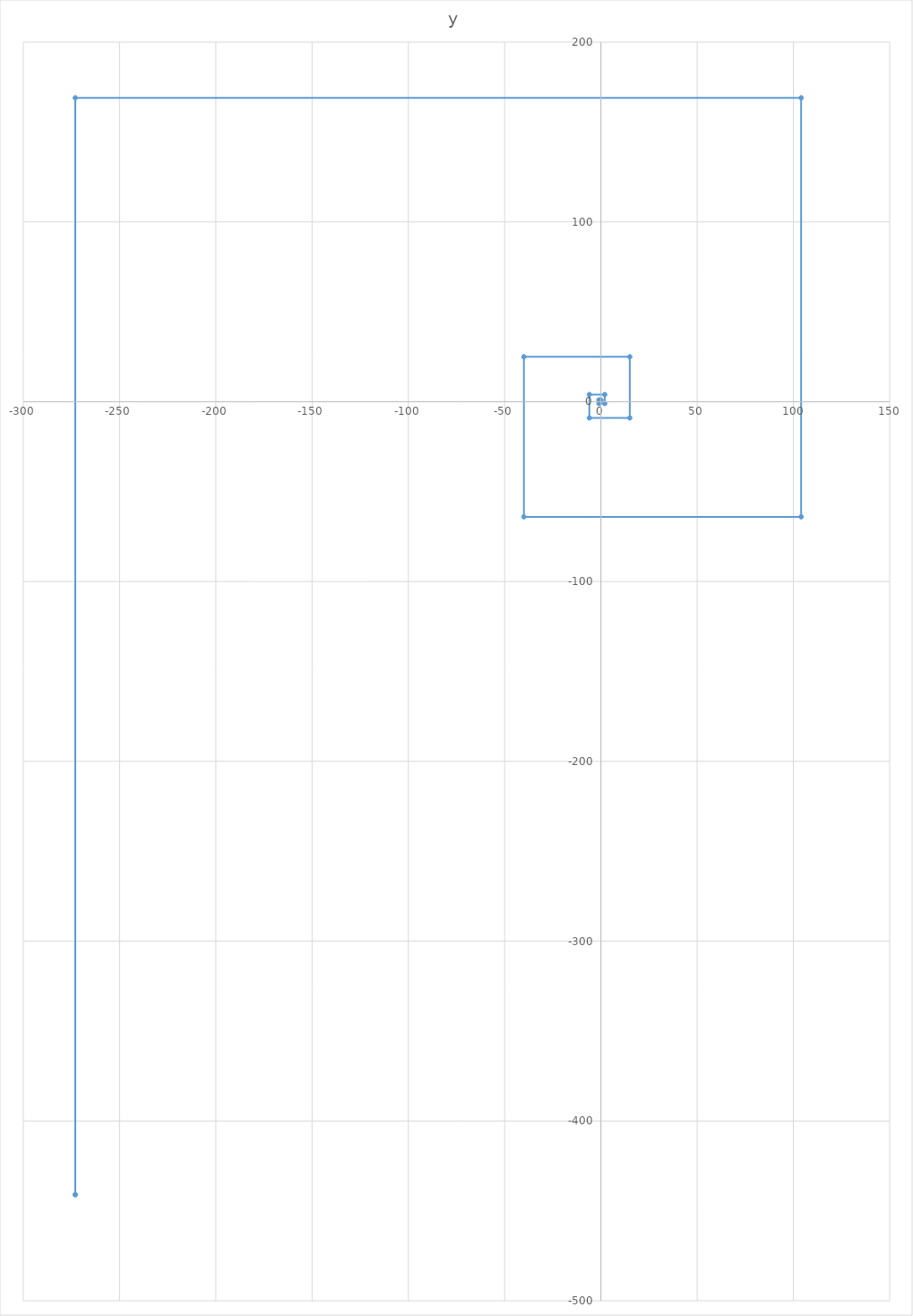
| Category | y |
|---|---|
| 0.0 | 1 |
| -1.0 | 1 |
| -1.0 | -1 |
| 2.0 | -1 |
| 2.0 | 4 |
| -6.0 | 4 |
| -6.0 | -9 |
| 15.0 | -9 |
| 15.0 | 25 |
| -40.0 | 25 |
| -40.0 | -64 |
| 104.0 | -64 |
| 104.0 | 169 |
| -273.0 | 169 |
| -273.0 | -441 |
| -273.0 | -441 |